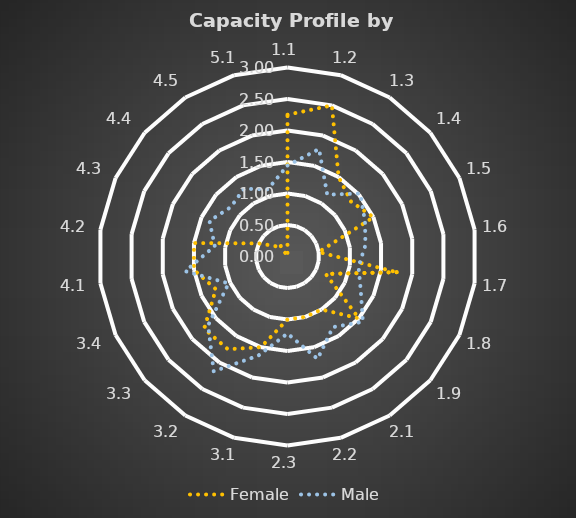
| Category | Female | Male |
|---|---|---|
| 1.1 | 2.25 | 1.444 |
| 1.2 | 2.5 | 1.778 |
| 1.3 | 1.5 | 1.167 |
| 1.4 | 1.333 | 1.528 |
| 1.5 | 1.5 | 1.352 |
| 1.6 | 0.5 | 1.25 |
| 1.7 | 1.75 | 1.139 |
| 1.8 | 0.667 | 1.278 |
| 1.9 | 1.5 | 1.583 |
| 2.1 | 1 | 1.333 |
| 2.2 | 1 | 1.694 |
| 2.3 | 1 | 1.222 |
| 3.1 | 1.5 | 1.639 |
| 3.2 | 1.75 | 2.167 |
| 3.3 | 1.75 | 1.667 |
| 3.4 | 1.25 | 1.028 |
| 4.1 | 1.5 | 1.639 |
| 4.2 | 1.5 | 1.167 |
| 4.3 | 0.5 | 1.361 |
| 4.4 | 0.25 | 1.194 |
| 4.5 | 0.25 | 1.278 |
| 5.1 | 0 | 1.111 |